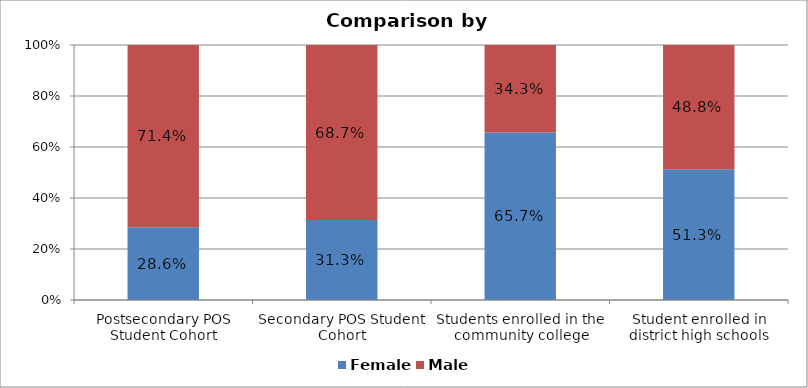
| Category | Female | Male |
|---|---|---|
| Postsecondary POS Student Cohort | 0.286 | 0.714 |
| Secondary POS Student Cohort | 0.313 | 0.687 |
| Students enrolled in the community college | 0.657 | 0.343 |
| Student enrolled in district high schools | 0.512 | 0.488 |